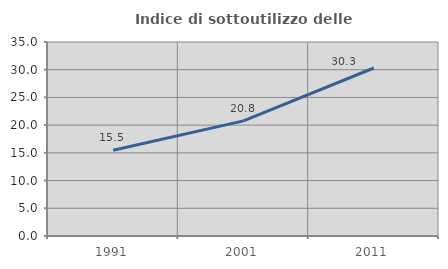
| Category | Indice di sottoutilizzo delle abitazioni  |
|---|---|
| 1991.0 | 15.47 |
| 2001.0 | 20.775 |
| 2011.0 | 30.307 |